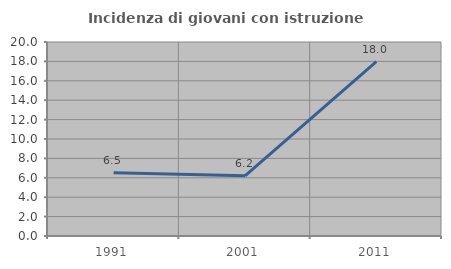
| Category | Incidenza di giovani con istruzione universitaria |
|---|---|
| 1991.0 | 6.522 |
| 2001.0 | 6.202 |
| 2011.0 | 17.986 |